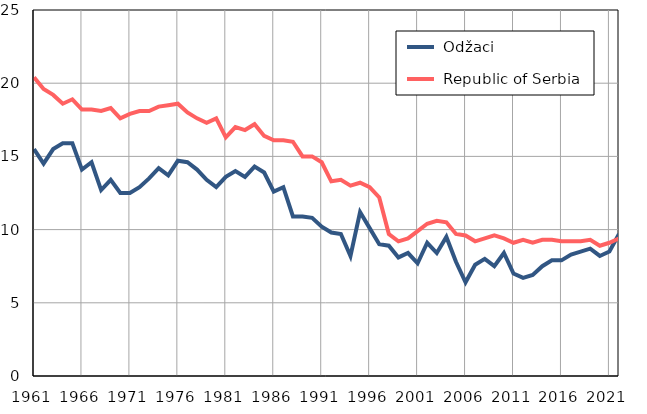
| Category |  Odžaci |  Republic of Serbia |
|---|---|---|
| 1961.0 | 15.5 | 20.4 |
| 1962.0 | 14.5 | 19.6 |
| 1963.0 | 15.5 | 19.2 |
| 1964.0 | 15.9 | 18.6 |
| 1965.0 | 15.9 | 18.9 |
| 1966.0 | 14.1 | 18.2 |
| 1967.0 | 14.6 | 18.2 |
| 1968.0 | 12.7 | 18.1 |
| 1969.0 | 13.4 | 18.3 |
| 1970.0 | 12.5 | 17.6 |
| 1971.0 | 12.5 | 17.9 |
| 1972.0 | 12.9 | 18.1 |
| 1973.0 | 13.5 | 18.1 |
| 1974.0 | 14.2 | 18.4 |
| 1975.0 | 13.7 | 18.5 |
| 1976.0 | 14.7 | 18.6 |
| 1977.0 | 14.6 | 18 |
| 1978.0 | 14.1 | 17.6 |
| 1979.0 | 13.4 | 17.3 |
| 1980.0 | 12.9 | 17.6 |
| 1981.0 | 13.6 | 16.3 |
| 1982.0 | 14 | 17 |
| 1983.0 | 13.6 | 16.8 |
| 1984.0 | 14.3 | 17.2 |
| 1985.0 | 13.9 | 16.4 |
| 1986.0 | 12.6 | 16.1 |
| 1987.0 | 12.9 | 16.1 |
| 1988.0 | 10.9 | 16 |
| 1989.0 | 10.9 | 15 |
| 1990.0 | 10.8 | 15 |
| 1991.0 | 10.2 | 14.6 |
| 1992.0 | 9.8 | 13.3 |
| 1993.0 | 9.7 | 13.4 |
| 1994.0 | 8.2 | 13 |
| 1995.0 | 11.2 | 13.2 |
| 1996.0 | 10.1 | 12.9 |
| 1997.0 | 9 | 12.2 |
| 1998.0 | 8.9 | 9.7 |
| 1999.0 | 8.1 | 9.2 |
| 2000.0 | 8.4 | 9.4 |
| 2001.0 | 7.7 | 9.9 |
| 2002.0 | 9.1 | 10.4 |
| 2003.0 | 8.4 | 10.6 |
| 2004.0 | 9.5 | 10.5 |
| 2005.0 | 7.8 | 9.7 |
| 2006.0 | 6.4 | 9.6 |
| 2007.0 | 7.6 | 9.2 |
| 2008.0 | 8 | 9.4 |
| 2009.0 | 7.5 | 9.6 |
| 2010.0 | 8.4 | 9.4 |
| 2011.0 | 7 | 9.1 |
| 2012.0 | 6.7 | 9.3 |
| 2013.0 | 6.9 | 9.1 |
| 2014.0 | 7.5 | 9.3 |
| 2015.0 | 7.9 | 9.3 |
| 2016.0 | 7.9 | 9.2 |
| 2017.0 | 8.3 | 9.2 |
| 2018.0 | 8.5 | 9.2 |
| 2019.0 | 8.7 | 9.3 |
| 2020.0 | 8.2 | 8.9 |
| 2021.0 | 8.5 | 9.1 |
| 2022.0 | 9.7 | 9.4 |